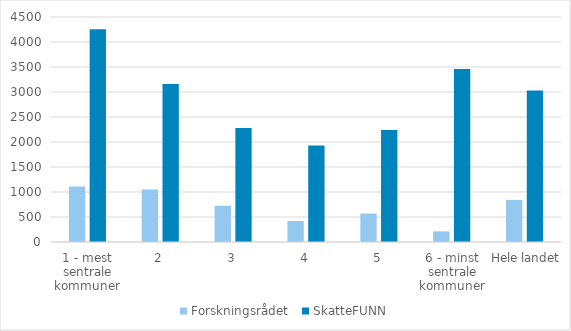
| Category | Forskningsrådet  | SkatteFUNN |
|---|---|---|
| 1 - mest sentrale kommuner | 1110.399 | 4254.103 |
| 2 | 1048.349 | 3162.062 |
| 3 | 723.578 | 2281.461 |
| 4 | 419.308 | 1932.447 |
| 5 | 568.933 | 2241.417 |
| 6 - minst sentrale kommuner | 212.558 | 3458.211 |
| Hele landet | 841.914 | 3029.572 |